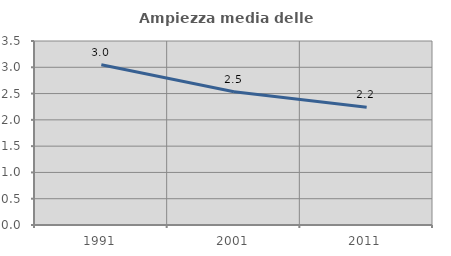
| Category | Ampiezza media delle famiglie |
|---|---|
| 1991.0 | 3.047 |
| 2001.0 | 2.534 |
| 2011.0 | 2.242 |